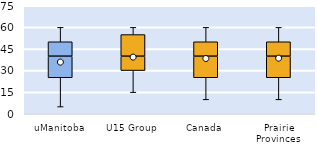
| Category | 25th | 50th | 75th |
|---|---|---|---|
| uManitoba | 25 | 15 | 10 |
| U15 Group | 30 | 10 | 15 |
| Canada | 25 | 15 | 10 |
| Prairie Provinces | 25 | 15 | 10 |